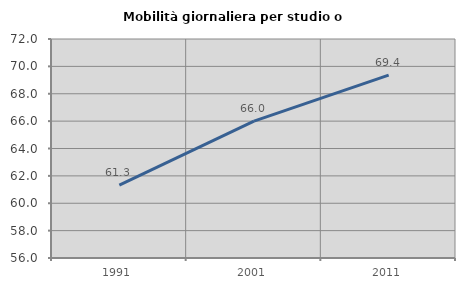
| Category | Mobilità giornaliera per studio o lavoro |
|---|---|
| 1991.0 | 61.327 |
| 2001.0 | 65.994 |
| 2011.0 | 69.359 |